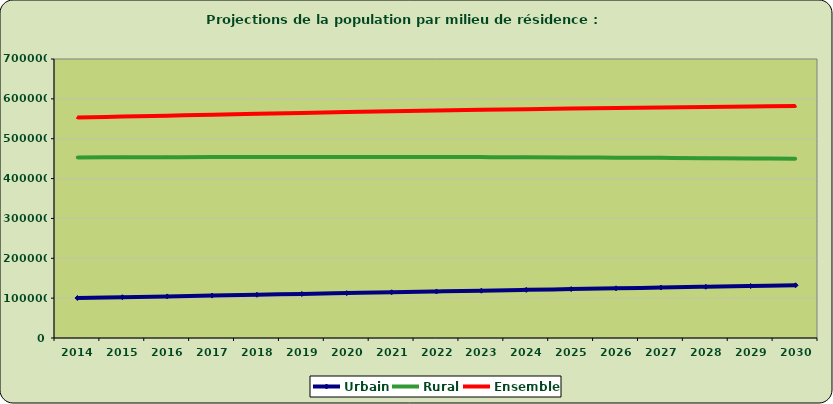
| Category | Urbain | Rural | Ensemble |
|---|---|---|---|
| 2014.0 | 100283 | 453056 | 553339 |
| 2015.0 | 102309 | 453296 | 555605 |
| 2016.0 | 104356 | 453570 | 557926 |
| 2017.0 | 106416 | 453835 | 560251 |
| 2018.0 | 108485 | 454059 | 562544 |
| 2019.0 | 110556 | 454209 | 564765 |
| 2020.0 | 112622 | 454267 | 566889 |
| 2021.0 | 114678 | 454223 | 568901 |
| 2022.0 | 116720 | 454074 | 570794 |
| 2023.0 | 118744 | 453824 | 572568 |
| 2024.0 | 120749 | 453480 | 574229 |
| 2025.0 | 122734 | 453054 | 575788 |
| 2026.0 | 124697 | 452546 | 577243 |
| 2027.0 | 126634 | 451958 | 578592 |
| 2028.0 | 128540 | 451287 | 579827 |
| 2029.0 | 130409 | 450533 | 580942 |
| 2030.0 | 132235 | 449696 | 581931 |